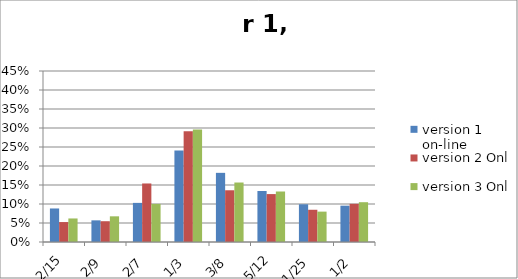
| Category | version 1 on-line | version 2 Online | version 3 Online |
|---|---|---|---|
| 0.13333333333333333 | 0.088 | 0.052 | 0.062 |
| 0.2222222222222222 | 0.057 | 0.055 | 0.068 |
| 0.2857142857142857 | 0.103 | 0.154 | 0.1 |
| 0.3333333333333333 | 0.241 | 0.291 | 0.296 |
| 0.375 | 0.182 | 0.136 | 0.157 |
| 0.4166666666666667 | 0.134 | 0.126 | 0.133 |
| 0.44 | 0.099 | 0.085 | 0.08 |
| 0.5 | 0.096 | 0.1 | 0.105 |